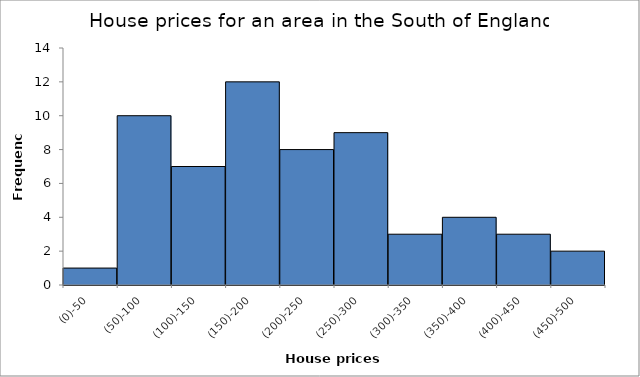
| Category | Frequency |
|---|---|
| (0)-50 | 1 |
| (50)-100 | 10 |
| (100)-150 | 7 |
| (150)-200 | 12 |
| (200)-250 | 8 |
| (250)-300 | 9 |
| (300)-350 | 3 |
| (350)-400 | 4 |
| (400)-450 | 3 |
| (450)-500 | 2 |